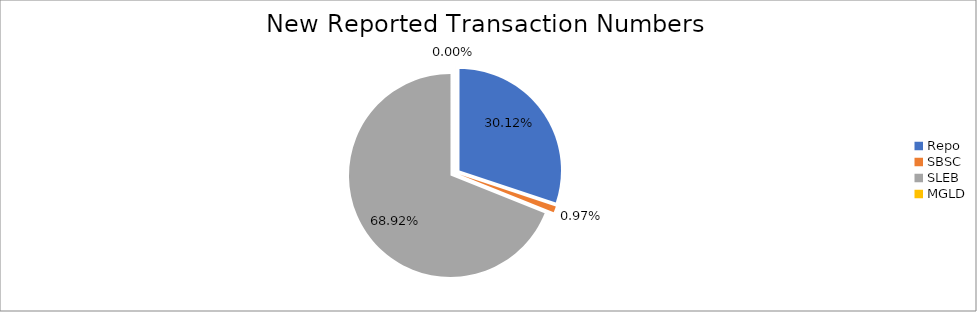
| Category | Series 0 |
|---|---|
| Repo | 309037 |
| SBSC | 9917 |
| SLEB | 707180 |
| MGLD | 11 |